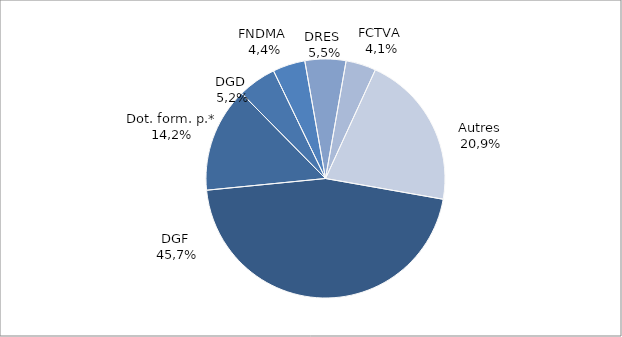
| Category | Series 0 |
|---|---|
| DGF | 0.457 |
| Dot. form. p.* | 0.142 |
| DGD | 0.052 |
| FNDMA | 0.044 |
| DRES | 0.055 |
| FCTVA | 0.041 |
| Autres | 0.209 |